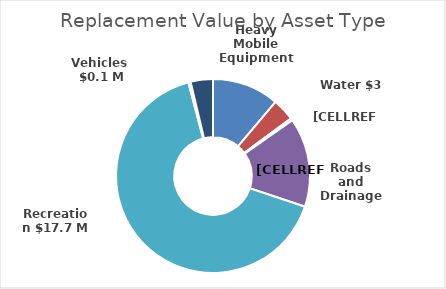
| Category | Series 1 |
|---|---|
| Water | 3000000 |
| Sewer | 1000000 |
| Roads and Drainage | 100000 |
| Buildings | 4000000 |
| Recreation | 17690000 |
| Vehicles  | 100000 |
| Heavy Mobile Equipment | 1000000 |